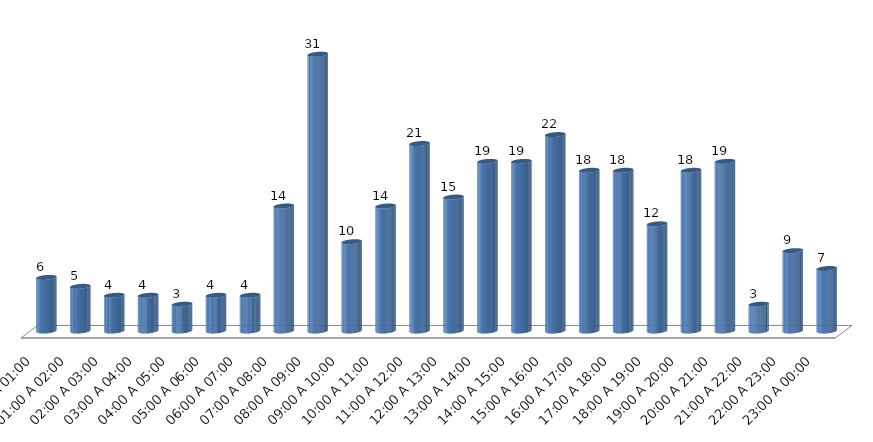
| Category | COMPUTO |
|---|---|
| 00:00 A 01:00 | 6 |
| 01:00 A 02:00 | 5 |
| 02:00 A 03:00 | 4 |
| 03:00 A 04:00 | 4 |
| 04:00 A 05:00 | 3 |
| 05:00 A 06:00 | 4 |
| 06:00 A 07:00 | 4 |
| 07:00 A 08:00 | 14 |
| 08:00 A 09:00 | 31 |
| 09:00 A 10:00 | 10 |
| 10:00 A 11:00 | 14 |
| 11:00 A 12:00 | 21 |
| 12:00 A 13:00 | 15 |
| 13:00 A 14:00 | 19 |
| 14:00 A 15:00 | 19 |
| 15:00 A 16:00 | 22 |
| 16:00 A 17:00 | 18 |
| 17:00 A 18:00 | 18 |
| 18:00 A 19:00 | 12 |
| 19:00 A 20:00 | 18 |
| 20:00 A 21:00 | 19 |
| 21:00 A 22:00 | 3 |
| 22:00 A 23:00 | 9 |
| 23:00 A 00:00 | 7 |